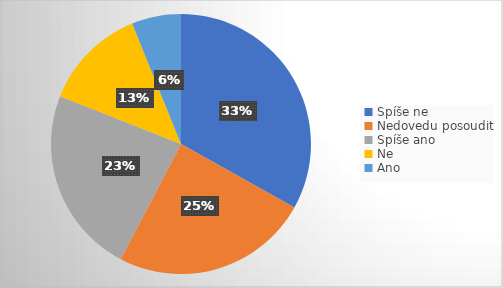
| Category | Series 0 |
|---|---|
| Spíše ne | 54 |
| Nedovedu posoudit | 40 |
| Spíše ano | 38 |
| Ne | 21 |
| Ano | 10 |